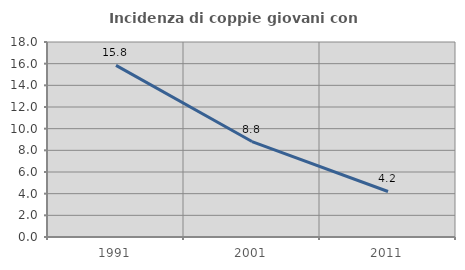
| Category | Incidenza di coppie giovani con figli |
|---|---|
| 1991.0 | 15.837 |
| 2001.0 | 8.811 |
| 2011.0 | 4.201 |